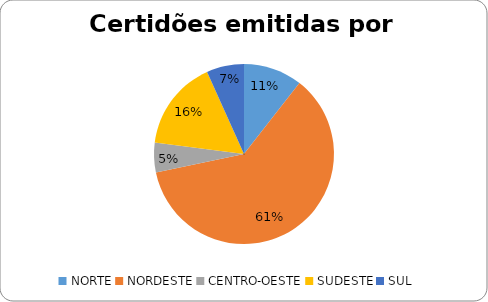
| Category | Series 0 |
|---|---|
| NORTE | 300 |
| NORDESTE | 1736 |
| CENTRO-OESTE | 151 |
| SUDESTE | 461 |
| SUL | 191 |